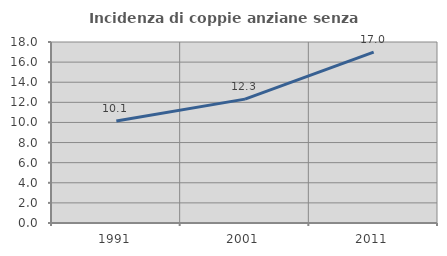
| Category | Incidenza di coppie anziane senza figli  |
|---|---|
| 1991.0 | 10.145 |
| 2001.0 | 12.32 |
| 2011.0 | 17.002 |